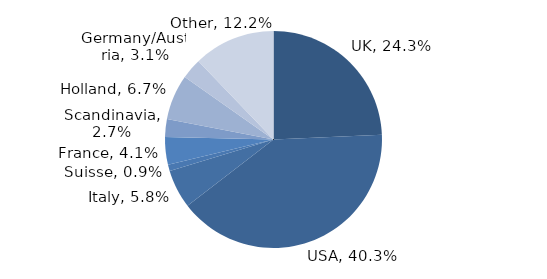
| Category | Investment Style |
|---|---|
| UK | 0.243 |
| USA | 0.403 |
| Italy | 0.058 |
| Suisse | 0.009 |
| France | 0.041 |
| Scandinavia | 0.027 |
| Holland | 0.067 |
| Germany/Austria | 0.031 |
| Other | 0.122 |